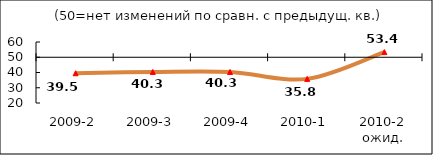
| Category | Диф.индекс ↓ |
|---|---|
| 2009-2 | 39.51 |
| 2009-3 | 40.34 |
| 2009-4 | 40.345 |
| 2010-1 | 35.815 |
| 2010-2 ожид. | 53.37 |